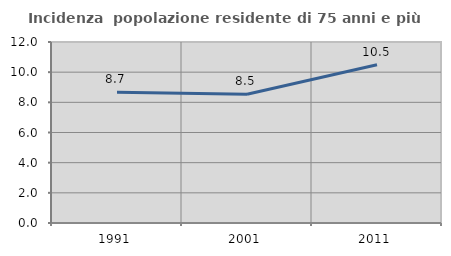
| Category | Incidenza  popolazione residente di 75 anni e più |
|---|---|
| 1991.0 | 8.667 |
| 2001.0 | 8.531 |
| 2011.0 | 10.491 |